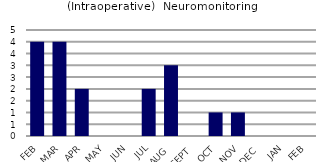
| Category | (Intraoperative)  Neuromonitoring |
|---|---|
| FEB | 4 |
| MAR | 4 |
| APR | 2 |
| MAY | 0 |
| JUN | 0 |
| JUL | 2 |
| AUG | 3 |
| SEPT | 0 |
| OCT | 1 |
| NOV | 1 |
| DEC | 0 |
| JAN | 0 |
| FEB | 0 |